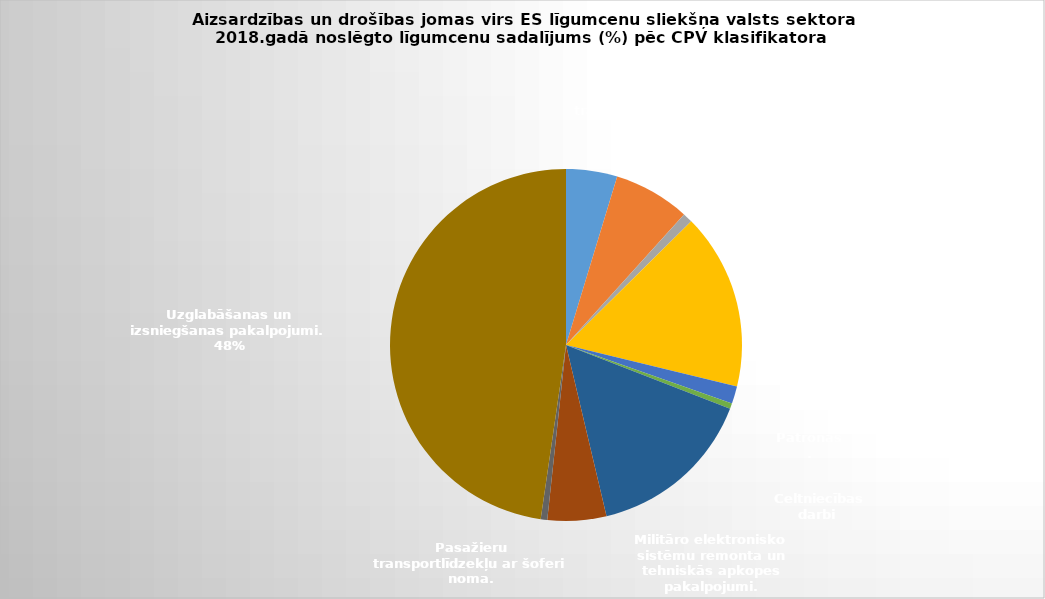
| Category | Series 0 |
|---|---|
| 0 | 0.047 |
| 1 | 0.07 |
| 2 | 0.009 |
| 3 | 0.162 |
| 4 | 0.016 |
| 5 | 0.005 |
| 6 | 0.154 |
| 7 | 0.054 |
| 8 | 0.006 |
| 9 | 0.477 |